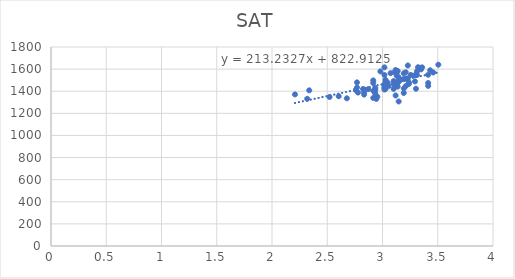
| Category | SAT |
|---|---|
| 2.208 | 1371.2 |
| 2.3184 | 1331.2 |
| 2.3368 | 1408 |
| 2.5208000000000004 | 1348 |
| 2.6036 | 1354.4 |
| 2.6772000000000005 | 1336 |
| 2.7600000000000002 | 1411.2 |
| 2.7600000000000002 | 1411.2 |
| 2.7692 | 1433.6 |
| 2.7692 | 1480 |
| 2.7784 | 1388 |
| 2.8244 | 1420 |
| 2.8336 | 1388 |
| 2.8336 | 1369.6 |
| 2.8704 | 1418.4 |
| 2.9164 | 1497.6 |
| 2.9164 | 1404 |
| 2.9164 | 1339.2 |
| 2.9164 | 1473.6 |
| 2.9348 | 1428.8 |
| 2.9348 | 1408.8 |
| 2.9348 | 1377.6 |
| 2.9440000000000004 | 1330.4 |
| 2.9532000000000003 | 1349.6 |
| 2.9808000000000003 | 1579.2 |
| 3.0176 | 1460.8 |
| 3.0176 | 1429.6 |
| 3.0176 | 1456.8 |
| 3.0176 | 1616 |
| 3.0176 | 1435.2 |
| 3.0176 | 1415.2 |
| 3.0176 | 1547.2 |
| 3.0268 | 1420 |
| 3.0268 | 1484 |
| 3.0268 | 1504 |
| 3.0452000000000004 | 1479.2 |
| 3.0544 | 1446.4 |
| 3.0728 | 1563.2 |
| 3.1004 | 1421.6 |
| 3.1004 | 1464.8 |
| 3.1004 | 1492 |
| 3.1096 | 1480 |
| 3.1096 | 1572.8 |
| 3.1188000000000002 | 1361.6 |
| 3.1188000000000002 | 1592 |
| 3.128 | 1540 |
| 3.128 | 1459.2 |
| 3.128 | 1564.8 |
| 3.1372000000000004 | 1485.6 |
| 3.1372000000000004 | 1583.2 |
| 3.1372000000000004 | 1441.6 |
| 3.1464 | 1484 |
| 3.1464 | 1525.6 |
| 3.1464 | 1307.2 |
| 3.1648 | 1503.2 |
| 3.1924 | 1509.6 |
| 3.1924 | 1384 |
| 3.1924 | 1562.4 |
| 3.1924 | 1424.8 |
| 3.2016 | 1512.8 |
| 3.2108000000000003 | 1571.2 |
| 3.2108000000000003 | 1446.4 |
| 3.22 | 1514.4 |
| 3.2292 | 1632.8 |
| 3.2292 | 1514.4 |
| 3.2384 | 1465.6 |
| 3.2384 | 1480 |
| 3.2568 | 1547.2 |
| 3.2936 | 1488.8 |
| 3.2936 | 1544.8 |
| 3.3028 | 1546.4 |
| 3.3028 | 1422.4 |
| 3.3120000000000003 | 1580 |
| 3.3120000000000003 | 1547.2 |
| 3.3212 | 1616.8 |
| 3.3304 | 1612 |
| 3.3488 | 1597.6 |
| 3.358 | 1616 |
| 3.4132000000000002 | 1474.4 |
| 3.4132000000000002 | 1548.8 |
| 3.4132000000000002 | 1448 |
| 3.4316 | 1589.6 |
| 3.4592 | 1569.6 |
| 3.5052000000000003 | 1640 |